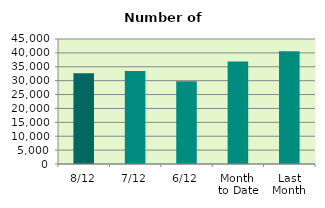
| Category | Series 0 |
|---|---|
| 8/12 | 32656 |
| 7/12 | 33482 |
| 6/12 | 29822 |
| Month 
to Date | 36916.667 |
| Last
Month | 40546.091 |